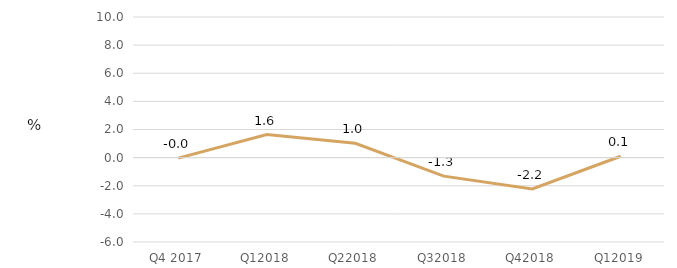
| Category | Series 0 |
|---|---|
| Q4 2017 | -0.038 |
| Q12018 | 1.635 |
| Q22018 | 1.016 |
| Q32018 | -1.315 |
| Q42018 | -2.226 |
| Q12019 | 0.099 |